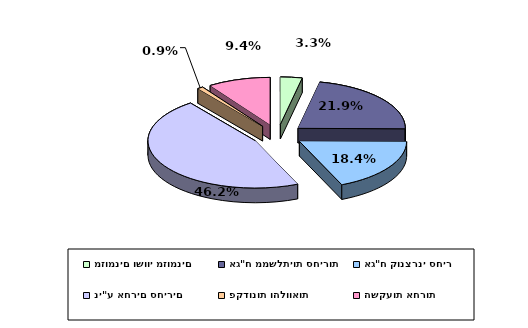
| Category | Series 0 |
|---|---|
| מזומנים ושווי מזומנים | 0.033 |
| אג"ח ממשלתיות סחירות | 0.219 |
| אג"ח קונצרני סחיר | 0.184 |
| ני"ע אחרים סחירים | 0.462 |
| פקדונות והלוואות | 0.009 |
| השקעות אחרות | 0.094 |